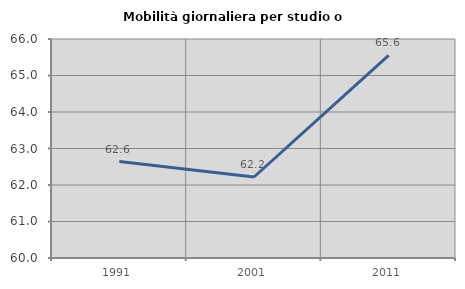
| Category | Mobilità giornaliera per studio o lavoro |
|---|---|
| 1991.0 | 62.643 |
| 2001.0 | 62.219 |
| 2011.0 | 65.552 |